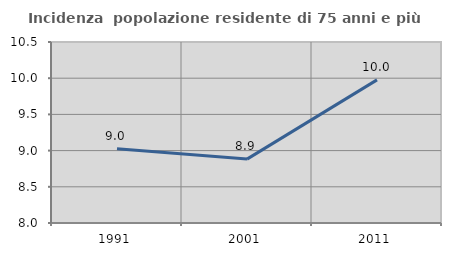
| Category | Incidenza  popolazione residente di 75 anni e più |
|---|---|
| 1991.0 | 9.026 |
| 2001.0 | 8.882 |
| 2011.0 | 9.977 |